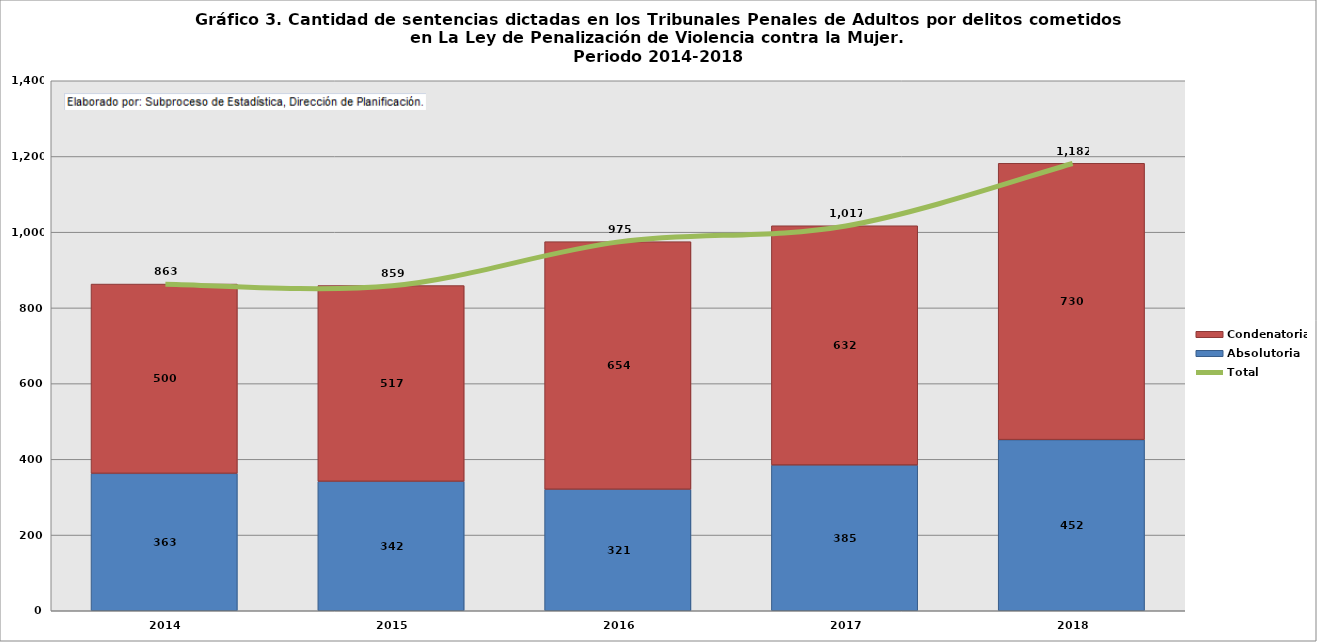
| Category | Absolutoria | Condenatoria |
|---|---|---|
| 2014.0 | 363 | 500 |
| 2015.0 | 342 | 517 |
| 2016.0 | 321 | 654 |
| 2017.0 | 385 | 632 |
| 2018.0 | 452 | 730 |